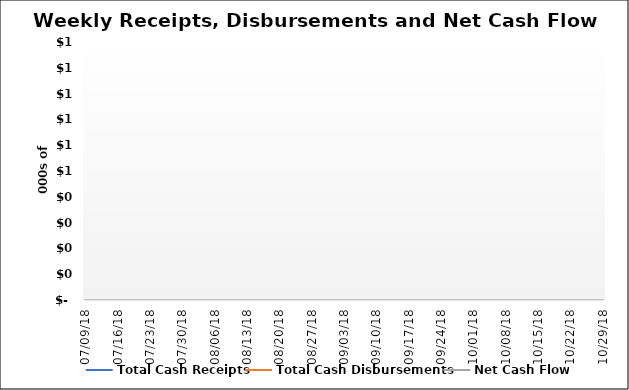
| Category | Total Cash Receipts | Total Cash Disbursements | Net Cash Flow |
|---|---|---|---|
| 2018-07-09 | 0 | 0 | 0 |
| 2018-07-16 | 0 | 0 | 0 |
| 2018-07-23 | 0 | 0 | 0 |
| 2018-07-30 | 0 | 0 | 0 |
| 2018-08-06 | 0 | 0 | 0 |
| 2018-08-13 | 0 | 0 | 0 |
| 2018-08-20 | 0 | 0 | 0 |
| 2018-08-27 | 0 | 0 | 0 |
| 2018-09-03 | 0 | 0 | 0 |
| 2018-09-10 | 0 | 0 | 0 |
| 2018-09-17 | 0 | 0 | 0 |
| 2018-09-24 | 0 | 0 | 0 |
| 2018-10-01 | 0 | 0 | 0 |
| 2018-10-08 | 0 | 0 | 0 |
| 2018-10-15 | 0 | 0 | 0 |
| 2018-10-22 | 0 | 0 | 0 |
| 2018-10-29 | 0 | 0 | 0 |